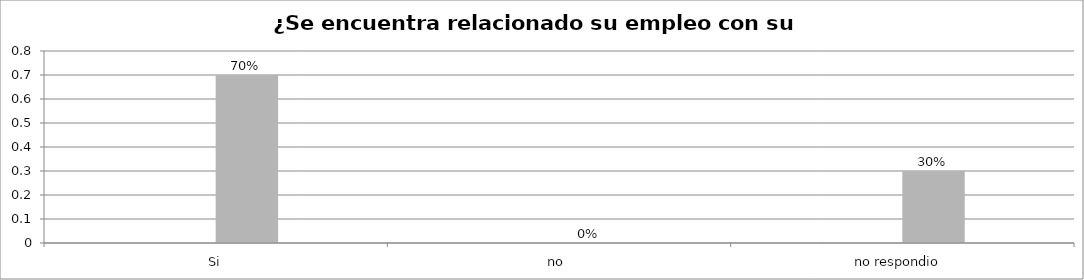
| Category | Series 0 | Series 1 | Series 2 | Series 3 |
|---|---|---|---|---|
| Si |  |  | 0.7 |  |
| no  |  |  | 0 |  |
| no respondio  |  |  | 0.3 |  |